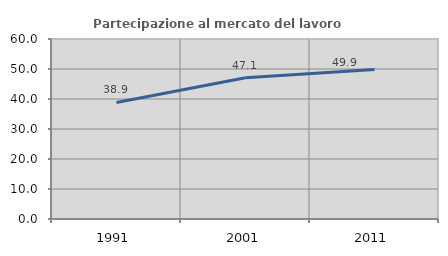
| Category | Partecipazione al mercato del lavoro  femminile |
|---|---|
| 1991.0 | 38.86 |
| 2001.0 | 47.059 |
| 2011.0 | 49.857 |